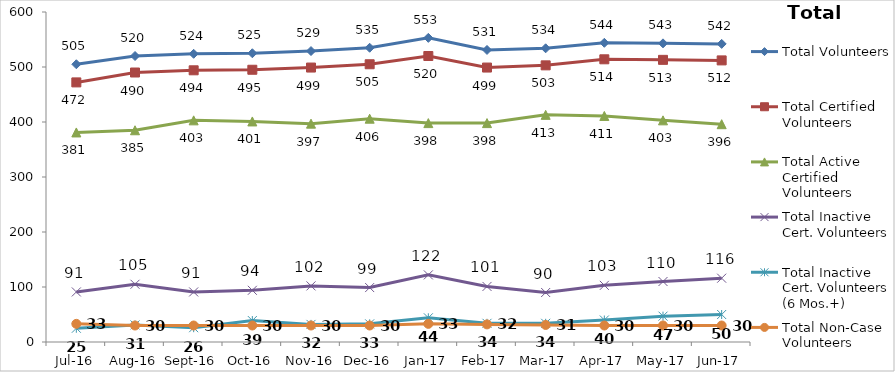
| Category | Total Volunteers | Total Certified Volunteers | Total Active Certified Volunteers | Total Inactive Cert. Volunteers | Total Inactive Cert. Volunteers (6 Mos.+) | Total Non-Case Volunteers |
|---|---|---|---|---|---|---|
| Jul-16 | 505 | 472 | 381 | 91 | 25 | 33 |
| Aug-16 | 520 | 490 | 385 | 105 | 31 | 30 |
| Sep-16 | 524 | 494 | 403 | 91 | 26 | 30 |
| Oct-16 | 525 | 495 | 401 | 94 | 39 | 30 |
| Nov-16 | 529 | 499 | 397 | 102 | 32 | 30 |
| Dec-16 | 535 | 505 | 406 | 99 | 33 | 30 |
| Jan-17 | 553 | 520 | 398 | 122 | 44 | 33 |
| Feb-17 | 531 | 499 | 398 | 101 | 34 | 32 |
| Mar-17 | 534 | 503 | 413 | 90 | 34 | 31 |
| Apr-17 | 544 | 514 | 411 | 103 | 40 | 30 |
| May-17 | 543 | 513 | 403 | 110 | 47 | 30 |
| Jun-17 | 542 | 512 | 396 | 116 | 50 | 30 |